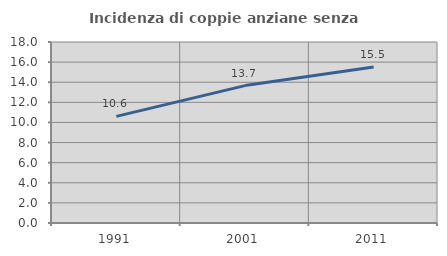
| Category | Incidenza di coppie anziane senza figli  |
|---|---|
| 1991.0 | 10.604 |
| 2001.0 | 13.666 |
| 2011.0 | 15.512 |